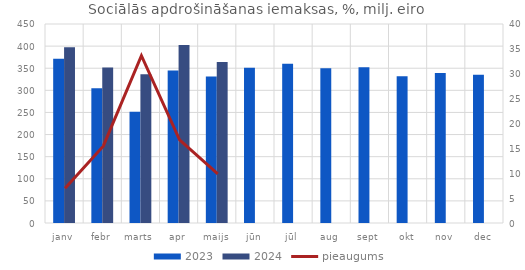
| Category | 2023 | 2024 |
|---|---|---|
| janv | 371.697 | 397.664 |
| febr | 304.659 | 351.713 |
| marts | 251.649 | 336.269 |
| apr | 344.906 | 402.61 |
| maijs | 331.367 | 364.078 |
| jūn | 350.907 | 0 |
| jūl | 360.075 | 0 |
| aug | 349.945 | 0 |
| sept | 352.283 | 0 |
| okt | 331.699 | 0 |
| nov | 339.067 | 0 |
| dec | 335.273 | 0 |